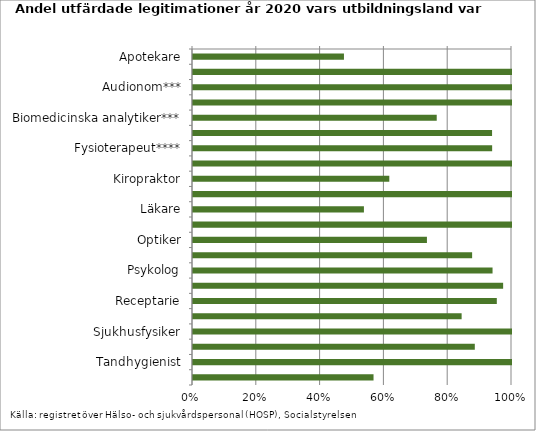
| Category | Series 0 |
|---|---|
| Apotekare | 0.473 |
| Arbetsterapeut | 1 |
| Audionom*** | 1 |
| Barnmorska | 1 |
| Biomedicinska analytiker*** | 0.764 |
| Dietist*** | 0.938 |
| Fysioterapeut**** | 0.938 |
| Hälso- och sjukvårdskurator*** | 1 |
| Kiropraktor | 0.615 |
| Logoped | 1 |
| Läkare | 0.536 |
| Naprapat | 1 |
| Optiker | 0.733 |
| Ortopedingenjör*** | 0.875 |
| Psykolog | 0.939 |
| Psykoterapeut | 0.972 |
| Receptarie | 0.952 |
| Röntgensjuksköterska*** | 0.842 |
| Sjukhusfysiker | 1 |
| Sjuksköterska | 0.883 |
| Tandhygienist | 1 |
| Tandläkare | 0.566 |